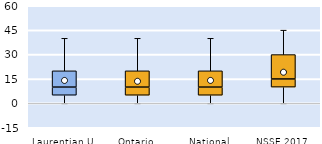
| Category | 25th | 50th | 75th |
|---|---|---|---|
| Laurentian U | 5 | 5 | 10 |
| Ontario | 5 | 5 | 10 |
| National | 5 | 5 | 10 |
| NSSE 2017 | 10 | 5 | 15 |